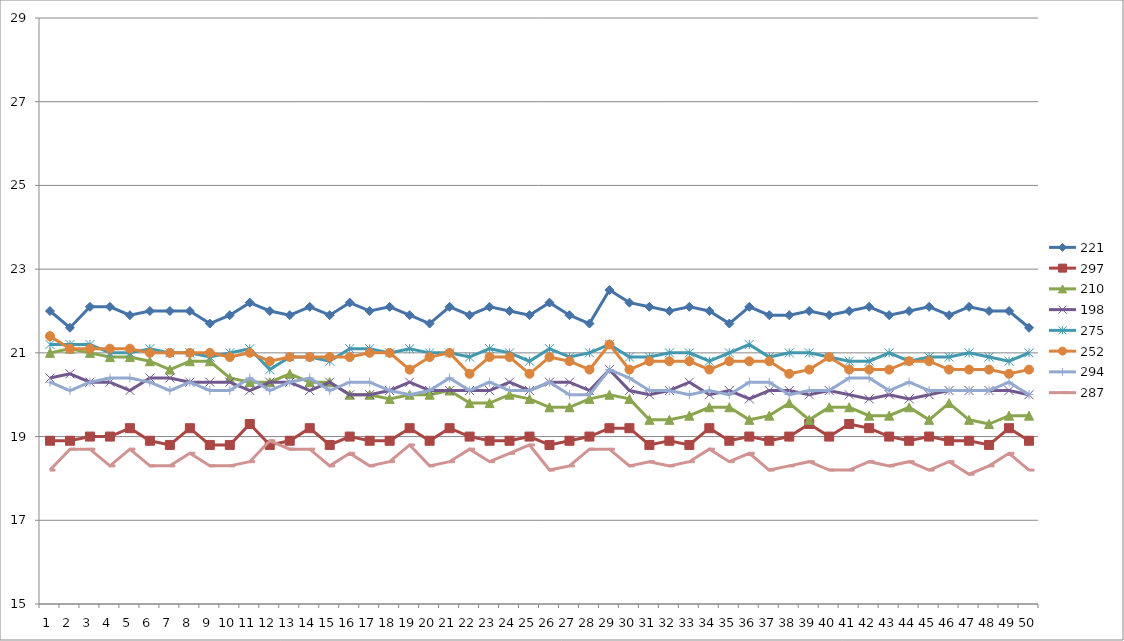
| Category | 221 | 297 | 210 | 198 | 275 | 252 | 294 | 287 |
|---|---|---|---|---|---|---|---|---|
| 0 | 22 | 18.9 | 21 | 20.4 | 21.2 | 21.4 | 20.3 | 18.2 |
| 1 | 21.6 | 18.9 | 21.1 | 20.5 | 21.2 | 21.1 | 20.1 | 18.7 |
| 2 | 22.1 | 19 | 21 | 20.3 | 21.2 | 21.1 | 20.3 | 18.7 |
| 3 | 22.1 | 19 | 20.9 | 20.3 | 21 | 21.1 | 20.4 | 18.3 |
| 4 | 21.9 | 19.2 | 20.9 | 20.1 | 21 | 21.1 | 20.4 | 18.7 |
| 5 | 22 | 18.9 | 20.8 | 20.4 | 21.1 | 21 | 20.3 | 18.3 |
| 6 | 22 | 18.8 | 20.6 | 20.4 | 21 | 21 | 20.1 | 18.3 |
| 7 | 22 | 19.2 | 20.8 | 20.3 | 21 | 21 | 20.3 | 18.6 |
| 8 | 21.7 | 18.8 | 20.8 | 20.3 | 20.9 | 21 | 20.1 | 18.3 |
| 9 | 21.9 | 18.8 | 20.4 | 20.3 | 21 | 20.9 | 20.1 | 18.3 |
| 10 | 22.2 | 19.3 | 20.3 | 20.1 | 21.1 | 21 | 20.4 | 18.4 |
| 11 | 22 | 18.8 | 20.3 | 20.3 | 20.6 | 20.8 | 20.1 | 18.9 |
| 12 | 21.9 | 18.9 | 20.5 | 20.3 | 20.9 | 20.9 | 20.3 | 18.7 |
| 13 | 22.1 | 19.2 | 20.3 | 20.1 | 20.9 | 20.9 | 20.4 | 18.7 |
| 14 | 21.9 | 18.8 | 20.3 | 20.3 | 20.8 | 20.9 | 20.1 | 18.3 |
| 15 | 22.2 | 19 | 20 | 20 | 21.1 | 20.9 | 20.3 | 18.6 |
| 16 | 22 | 18.9 | 20 | 20 | 21.1 | 21 | 20.3 | 18.3 |
| 17 | 22.1 | 18.9 | 19.9 | 20.1 | 21 | 21 | 20.1 | 18.4 |
| 18 | 21.9 | 19.2 | 20 | 20.3 | 21.1 | 20.6 | 20 | 18.8 |
| 19 | 21.7 | 18.9 | 20 | 20.1 | 21 | 20.9 | 20.1 | 18.3 |
| 20 | 22.1 | 19.2 | 20.1 | 20.1 | 21 | 21 | 20.4 | 18.4 |
| 21 | 21.9 | 19 | 19.8 | 20.1 | 20.9 | 20.5 | 20.1 | 18.7 |
| 22 | 22.1 | 18.9 | 19.8 | 20.1 | 21.1 | 20.9 | 20.3 | 18.4 |
| 23 | 22 | 18.9 | 20 | 20.3 | 21 | 20.9 | 20.1 | 18.6 |
| 24 | 21.9 | 19 | 19.9 | 20.1 | 20.8 | 20.5 | 20.1 | 18.8 |
| 25 | 22.2 | 18.8 | 19.7 | 20.3 | 21.1 | 20.9 | 20.3 | 18.2 |
| 26 | 21.9 | 18.9 | 19.7 | 20.3 | 20.9 | 20.8 | 20 | 18.3 |
| 27 | 21.7 | 19 | 19.9 | 20.1 | 21 | 20.6 | 20 | 18.7 |
| 28 | 22.5 | 19.2 | 20 | 20.6 | 21.2 | 21.2 | 20.6 | 18.7 |
| 29 | 22.2 | 19.2 | 19.9 | 20.1 | 20.9 | 20.6 | 20.4 | 18.3 |
| 30 | 22.1 | 18.8 | 19.4 | 20 | 20.9 | 20.8 | 20.1 | 18.4 |
| 31 | 22 | 18.9 | 19.4 | 20.1 | 21 | 20.8 | 20.1 | 18.3 |
| 32 | 22.1 | 18.8 | 19.5 | 20.3 | 21 | 20.8 | 20 | 18.4 |
| 33 | 22 | 19.2 | 19.7 | 20 | 20.8 | 20.6 | 20.1 | 18.7 |
| 34 | 21.7 | 18.9 | 19.7 | 20.1 | 21 | 20.8 | 20 | 18.4 |
| 35 | 22.1 | 19 | 19.4 | 19.9 | 21.2 | 20.8 | 20.3 | 18.6 |
| 36 | 21.9 | 18.9 | 19.5 | 20.1 | 20.9 | 20.8 | 20.3 | 18.2 |
| 37 | 21.9 | 19 | 19.8 | 20.1 | 21 | 20.5 | 20 | 18.3 |
| 38 | 22 | 19.3 | 19.4 | 20 | 21 | 20.6 | 20.1 | 18.4 |
| 39 | 21.9 | 19 | 19.7 | 20.1 | 20.9 | 20.9 | 20.1 | 18.2 |
| 40 | 22 | 19.3 | 19.7 | 20 | 20.8 | 20.6 | 20.4 | 18.2 |
| 41 | 22.1 | 19.2 | 19.5 | 19.9 | 20.8 | 20.6 | 20.4 | 18.4 |
| 42 | 21.9 | 19 | 19.5 | 20 | 21 | 20.6 | 20.1 | 18.3 |
| 43 | 22 | 18.9 | 19.7 | 19.9 | 20.8 | 20.8 | 20.3 | 18.4 |
| 44 | 22.1 | 19 | 19.4 | 20 | 20.9 | 20.8 | 20.1 | 18.2 |
| 45 | 21.9 | 18.9 | 19.8 | 20.1 | 20.9 | 20.6 | 20.1 | 18.4 |
| 46 | 22.1 | 18.9 | 19.4 | 20.1 | 21 | 20.6 | 20.1 | 18.1 |
| 47 | 22 | 18.8 | 19.3 | 20.1 | 20.9 | 20.6 | 20.1 | 18.3 |
| 48 | 22 | 19.2 | 19.5 | 20.1 | 20.8 | 20.5 | 20.3 | 18.6 |
| 49 | 21.6 | 18.9 | 19.5 | 20 | 21 | 20.6 | 20 | 18.2 |